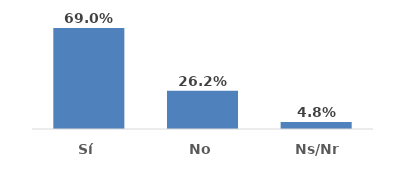
| Category | Series 0 |
|---|---|
| Sí | 0.69 |
| No | 0.262 |
| Ns/Nr | 0.048 |